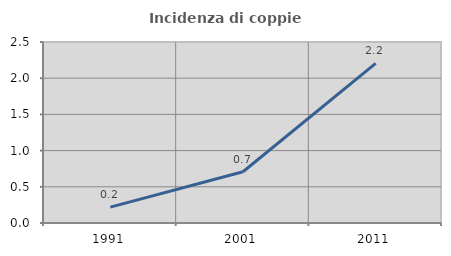
| Category | Incidenza di coppie miste |
|---|---|
| 1991.0 | 0.22 |
| 2001.0 | 0.707 |
| 2011.0 | 2.204 |